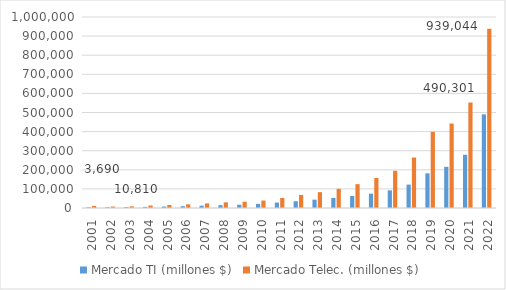
| Category | Mercado TI (millones $) | Mercado Telec. (millones $) |
|---|---|---|
| 2001.0 | 3690 | 10810 |
| 2002.0 | 3970 | 7550 |
| 2003.0 | 4760 | 8885 |
| 2004.0 | 5900 | 13060 |
| 2005.0 | 7630 | 15660 |
| 2006.0 | 9500 | 19100 |
| 2007.0 | 12000 | 24055 |
| 2008.0 | 14850 | 29600 |
| 2009.0 | 17200 | 33000 |
| 2010.0 | 21545 | 39081 |
| 2011.0 | 28321 | 52265 |
| 2012.0 | 35407 | 68098 |
| 2013.0 | 43498 | 82971 |
| 2014.0 | 52620 | 100428 |
| 2015.0 | 62784 | 124836 |
| 2016.0 | 75029 | 157181 |
| 2017.0 | 92305 | 194883 |
| 2018.0 | 122492 | 264244 |
| 2019.0 | 181551 | 398691 |
| 2020.0 | 215471 | 442265 |
| 2021.0 | 278830 | 552236 |
| 2022.0 | 490301 | 939044 |